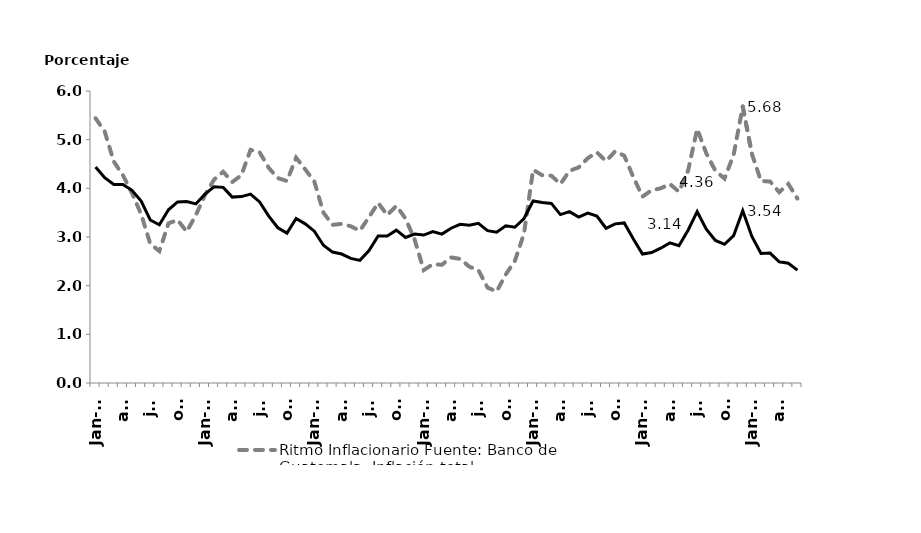
| Category | Series 0 |   |
|---|---|---|
| ene-12 | 5.44 | 4.44 |
| feb | 5.17 | 4.22 |
| mar | 4.55 | 4.08 |
| abr | 4.27 | 4.08 |
| may | 3.9 | 3.96 |
| jun | 3.47 | 3.74 |
| jul | 2.86 | 3.35 |
| ago | 2.71 | 3.25 |
| sep | 3.28 | 3.56 |
| oct | 3.35 | 3.72 |
| nov | 3.11 | 3.73 |
| dic | 3.45 | 3.68 |
| ene-13 | 3.86 | 3.88 |
| feb | 4.18 | 4.03 |
| mar | 4.34 | 4.02 |
| abr | 4.13 | 3.82 |
| may | 4.27 | 3.83 |
| jun | 4.79 | 3.88 |
| jul | 4.74 | 3.72 |
| ago | 4.42 | 3.43 |
| sep | 4.21 | 3.19 |
| oct | 4.15 | 3.08 |
| nov | 4.63 | 3.38 |
| dic | 4.39 | 3.27 |
| ene-14 | 4.14 | 3.12 |
| feb | 3.5 | 2.83 |
| mar | 3.25 | 2.69 |
| abr | 3.27 | 2.65 |
| may | 3.22 | 2.56 |
| jun | 3.13 | 2.52 |
| jul | 3.41 | 2.72 |
| ago | 3.7 | 3.02 |
| sep | 3.45 | 3.02 |
| oct | 3.64 | 3.14 |
| nov | 3.38 | 2.99 |
| dic | 2.95 | 3.06 |
| ene-15 | 2.32 | 3.04 |
| feb | 2.44 | 3.11 |
| mar | 2.43 | 3.06 |
| abr | 2.58 | 3.18 |
| may | 2.55 | 3.26 |
| jun | 2.39 | 3.24 |
| jul | 2.32 | 3.28 |
| ago | 1.96 | 3.13 |
| sep | 1.88 | 3.1 |
| oct | 2.23 | 3.23 |
| nov | 2.51 | 3.2 |
| dic | 3.07 | 3.38 |
| ene-16 | 4.38 | 3.74 |
| feb | 4.27 | 3.71 |
| mar | 4.26 | 3.69 |
| abr | 4.09 | 3.46 |
| may | 4.36 | 3.52 |
| jun | 4.43 | 3.41 |
| jul | 4.62 | 3.49 |
| ago | 4.74 | 3.43 |
| sep | 4.56 | 3.18 |
| oct | 4.76 | 3.27 |
| nov | 4.67 | 3.29 |
| dic | 4.23 | 2.96 |
| ene-17 | 3.83 | 2.65 |
| feb | 3.96 | 2.68 |
| mar | 4 | 2.77 |
| abr | 4.09 | 2.88 |
| may | 3.93 | 2.82 |
| jun | 4.36 | 3.14 |
| jul | 5.22 | 3.52 |
| ago | 4.72 | 3.16 |
| sep | 4.36 | 2.93 |
| oct | 4.2 | 2.85 |
| nov | 4.69 | 3.03 |
| dic | 5.68 | 3.54 |
| ene-18 | 4.71 | 3.01 |
| feb | 4.15 | 2.66 |
| mar | 4.14 | 2.67 |
| abr | 3.92 | 2.49 |
| may | 4.09 | 2.46 |
| jun | 3.79 | 2.32 |